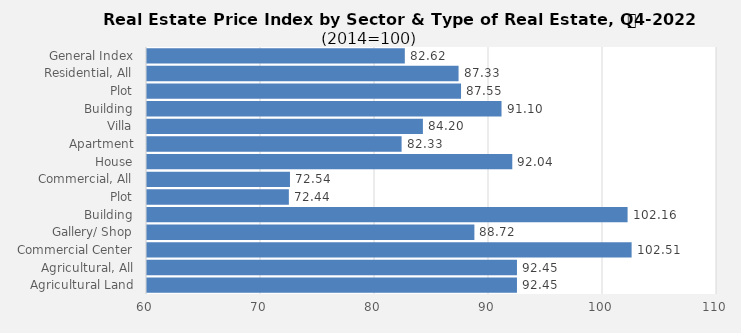
| Category | 2022 |
|---|---|
| General Index | 82.616 |
| Residential, All | 87.33 |
| Plot | 87.547 |
| Building | 91.098 |
| Villa | 84.202 |
| Apartment | 82.334 |
| House | 92.043 |
| Commercial, All | 72.541 |
| Plot | 72.444 |
| Building | 102.156 |
| Gallery/ Shop | 88.719 |
| Commercial Center | 102.51 |
| Agricultural, All | 92.453 |
| Agricultural Land | 92.453 |